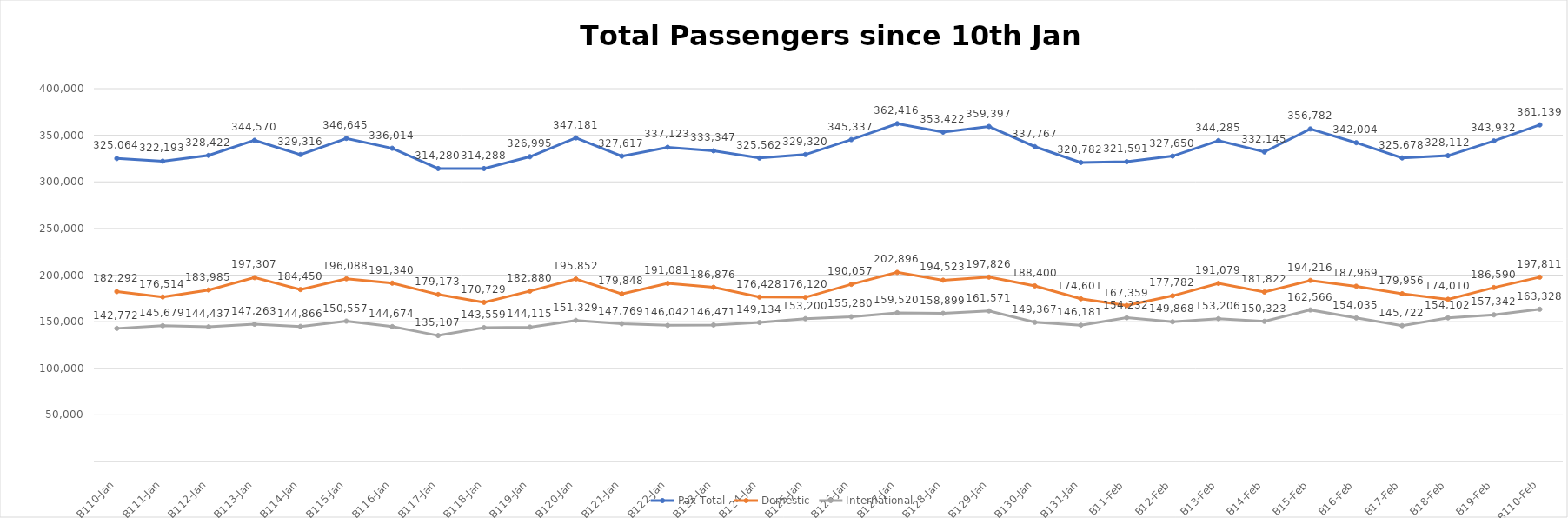
| Category | Pax Total |  Domestic  |  International  |
|---|---|---|---|
| 2023-01-10 | 325064 | 182292 | 142772 |
| 2023-01-11 | 322193 | 176514 | 145679 |
| 2023-01-12 | 328422 | 183985 | 144437 |
| 2023-01-13 | 344570 | 197307 | 147263 |
| 2023-01-14 | 329316 | 184450 | 144866 |
| 2023-01-15 | 346645 | 196088 | 150557 |
| 2023-01-16 | 336014 | 191340 | 144674 |
| 2023-01-17 | 314280 | 179173 | 135107 |
| 2023-01-18 | 314288 | 170729 | 143559 |
| 2023-01-19 | 326995 | 182880 | 144115 |
| 2023-01-20 | 347181 | 195852 | 151329 |
| 2023-01-21 | 327617 | 179848 | 147769 |
| 2023-01-22 | 337123 | 191081 | 146042 |
| 2023-01-23 | 333347 | 186876 | 146471 |
| 2023-01-24 | 325562 | 176428 | 149134 |
| 2023-01-25 | 329320 | 176120 | 153200 |
| 2023-01-26 | 345337 | 190057 | 155280 |
| 2023-01-27 | 362416 | 202896 | 159520 |
| 2023-01-28 | 353422 | 194523 | 158899 |
| 2023-01-29 | 359397 | 197826 | 161571 |
| 2023-01-30 | 337767 | 188400 | 149367 |
| 2023-01-31 | 320782 | 174601 | 146181 |
| 2023-02-01 | 321591 | 167359 | 154232 |
| 2023-02-02 | 327650 | 177782 | 149868 |
| 2023-02-03 | 344285 | 191079 | 153206 |
| 2023-02-04 | 332145 | 181822 | 150323 |
| 2023-02-05 | 356782 | 194216 | 162566 |
| 2023-02-06 | 342004 | 187969 | 154035 |
| 2023-02-07 | 325678 | 179956 | 145722 |
| 2023-02-08 | 328112 | 174010 | 154102 |
| 2023-02-09 | 343932 | 186590 | 157342 |
| 2023-02-10 | 361139 | 197811 | 163328 |